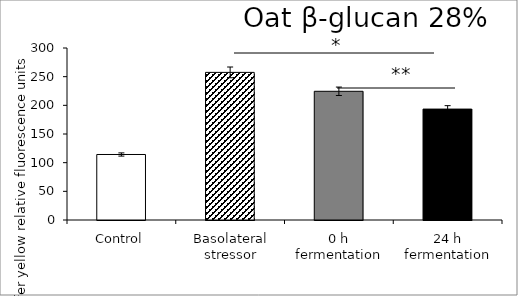
| Category | average |
|---|---|
| Control | 114.26 |
| Basolateral stressor | 257.479 |
| 0 h fermentation | 224.498 |
| 24 h fermentation | 193.456 |